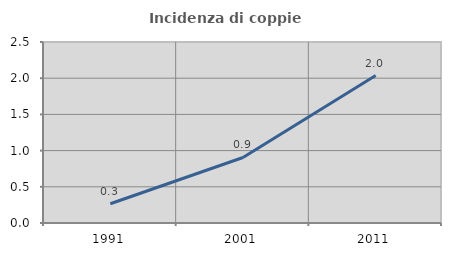
| Category | Incidenza di coppie miste |
|---|---|
| 1991.0 | 0.266 |
| 2001.0 | 0.905 |
| 2011.0 | 2.037 |